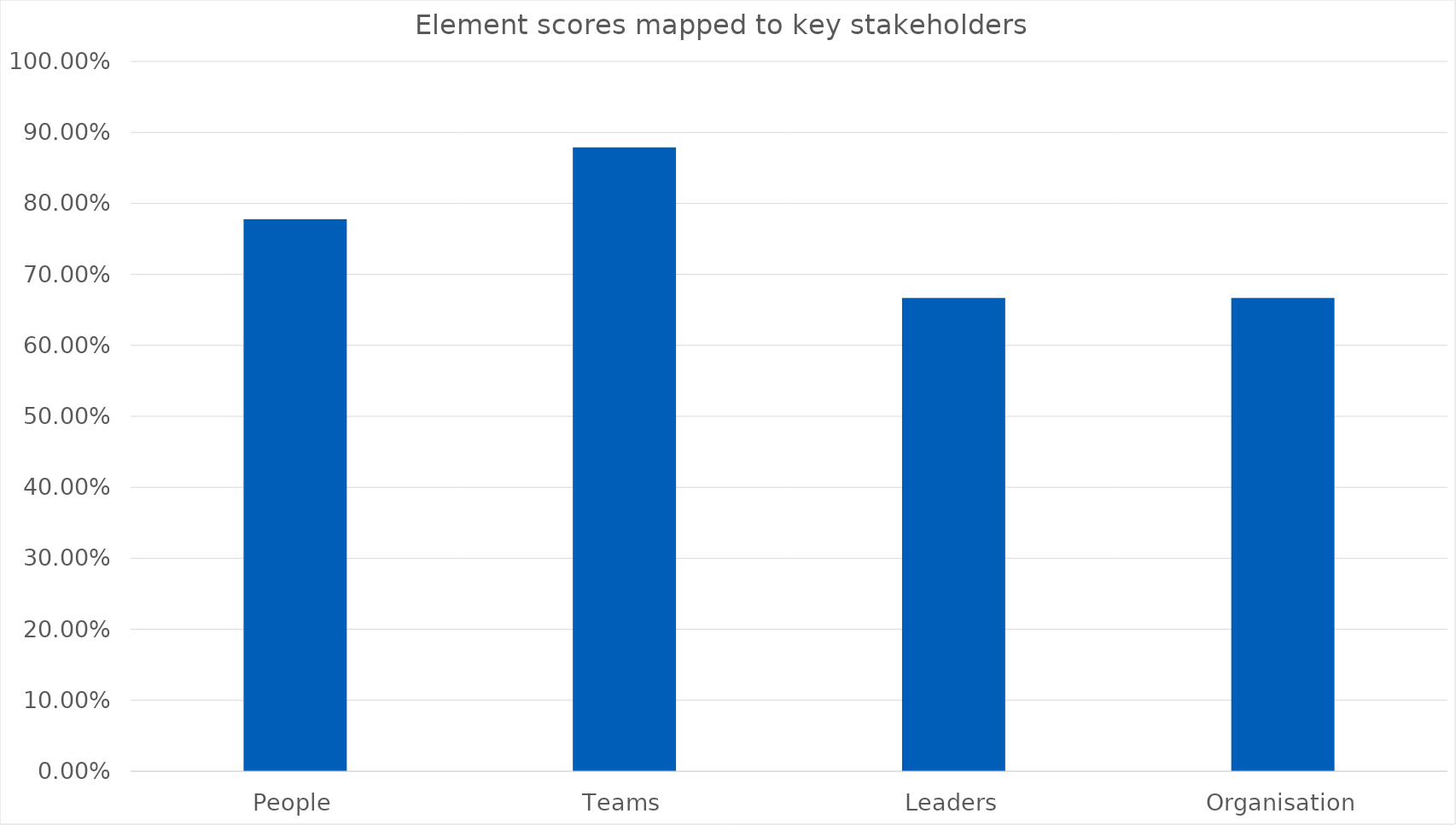
| Category | Series 0 |
|---|---|
| People | 0.778 |
| Teams | 0.879 |
| Leaders | 0.667 |
| Organisation | 0.667 |